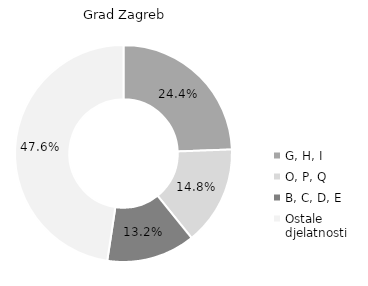
| Category | Grad Zagreb |
|---|---|
| G, H, I | 24.4 |
| O, P, Q | 14.8 |
| B, C, D, E | 13.2 |
| Ostale djelatnosti | 47.6 |